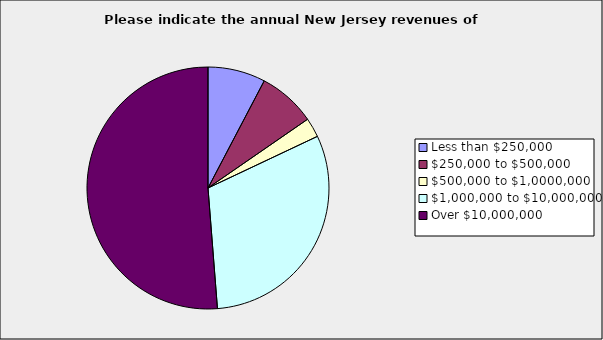
| Category | Series 0 |
|---|---|
| Less than $250,000 | 0.077 |
| $250,000 to $500,000 | 0.077 |
| $500,000 to $1,0000,000 | 0.026 |
| $1,000,000 to $10,000,000 | 0.308 |
| Over $10,000,000 | 0.513 |